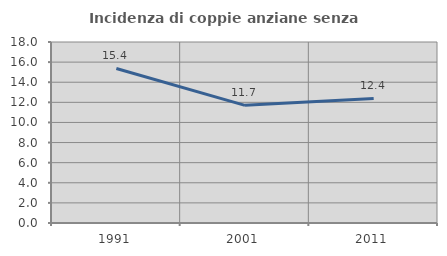
| Category | Incidenza di coppie anziane senza figli  |
|---|---|
| 1991.0 | 15.37 |
| 2001.0 | 11.7 |
| 2011.0 | 12.386 |